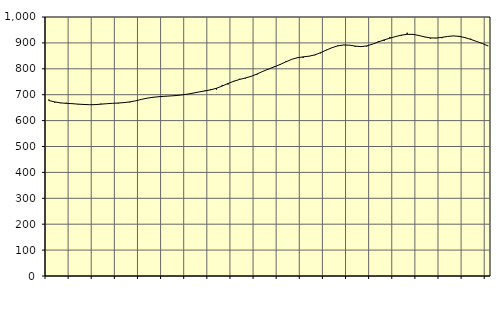
| Category | Piggar | Series 1 |
|---|---|---|
| nan | 681.4 | 677.5 |
| 1.0 | 669.4 | 672.19 |
| 1.0 | 667.3 | 668.44 |
| 1.0 | 668.9 | 666.61 |
| nan | 665 | 665.43 |
| 2.0 | 662.6 | 663.72 |
| 2.0 | 664 | 662.31 |
| 2.0 | 661.3 | 661.38 |
| nan | 660.5 | 661.67 |
| 3.0 | 665.2 | 663.46 |
| 3.0 | 665.6 | 665.22 |
| 3.0 | 666.4 | 666.65 |
| nan | 666.1 | 667.89 |
| 4.0 | 670.3 | 669.51 |
| 4.0 | 670.3 | 672.23 |
| 4.0 | 676.6 | 676.34 |
| nan | 682.3 | 681.81 |
| 5.0 | 686.6 | 686.63 |
| 5.0 | 691.2 | 689.92 |
| 5.0 | 691.1 | 692.16 |
| nan | 694.8 | 693.86 |
| 6.0 | 695.3 | 695.15 |
| 6.0 | 694.9 | 696.68 |
| 6.0 | 699.8 | 699.03 |
| nan | 701.2 | 702.3 |
| 7.0 | 706.9 | 706.27 |
| 7.0 | 710.8 | 710.67 |
| 7.0 | 715.9 | 714.65 |
| nan | 721.5 | 718.8 |
| 8.0 | 719.8 | 724.88 |
| 8.0 | 737.7 | 733.46 |
| 8.0 | 739.1 | 743.34 |
| nan | 753.2 | 751.91 |
| 9.0 | 761.4 | 758.96 |
| 9.0 | 762.8 | 764.5 |
| 9.0 | 771.2 | 770.85 |
| nan | 777.4 | 779.86 |
| 10.0 | 791 | 789.93 |
| 10.0 | 798.3 | 799.03 |
| 10.0 | 809.9 | 807.45 |
| nan | 814.9 | 816.57 |
| 11.0 | 828.6 | 826.72 |
| 11.0 | 835.6 | 836.32 |
| 11.0 | 844.8 | 842.81 |
| nan | 842.1 | 846.08 |
| 12.0 | 848.1 | 848.64 |
| 12.0 | 852.4 | 853.58 |
| 12.0 | 859.8 | 862.12 |
| nan | 873.3 | 872.1 |
| 13.0 | 881.5 | 881.57 |
| 13.0 | 890.4 | 888.65 |
| 13.0 | 892.4 | 891.92 |
| nan | 891.6 | 891.11 |
| 14.0 | 885.4 | 887.68 |
| 14.0 | 885.8 | 885.59 |
| 14.0 | 886 | 888.33 |
| nan | 895.7 | 895.21 |
| 15.0 | 907 | 903.63 |
| 15.0 | 907.2 | 911.62 |
| 15.0 | 922.7 | 918.15 |
| nan | 926.1 | 924.6 |
| 16.0 | 927.4 | 929.99 |
| 16.0 | 939.2 | 933.1 |
| 16.0 | 931.5 | 932.86 |
| nan | 930.3 | 928.78 |
| 17.0 | 922.2 | 923.21 |
| 17.0 | 916.7 | 919.29 |
| 17.0 | 919.6 | 918.67 |
| nan | 918.1 | 921.36 |
| 18.0 | 924.6 | 924.94 |
| 18.0 | 927.3 | 926.97 |
| 18.0 | 922.6 | 925.29 |
| nan | 918.9 | 920.36 |
| 19.0 | 916 | 913.65 |
| 19.0 | 906.2 | 905.64 |
| 19.0 | 897.3 | 897.69 |
| nan | 888.8 | 888 |